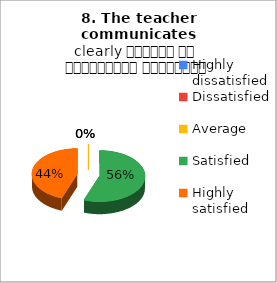
| Category | 8. The teacher communicates clearly शिक्षक का सम्प्रेषण सुस्पष्ट है |
|---|---|
| Highly dissatisfied | 0 |
| Dissatisfied | 0 |
| Average | 0 |
| Satisfied | 5 |
| Highly satisfied | 4 |